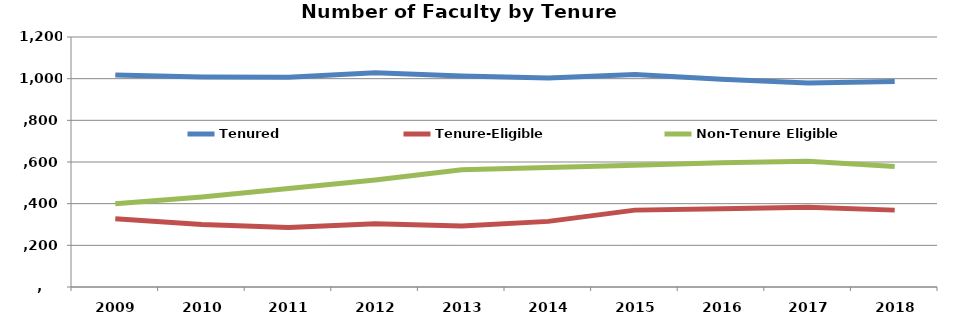
| Category | Tenured | Tenure-Eligible | Non-Tenure Eligible |
|---|---|---|---|
| 2009.0 | 1018 | 328 | 400 |
| 2010.0 | 1008 | 300 | 432 |
| 2011.0 | 1007 | 286 | 473 |
| 2012.0 | 1028 | 303 | 514 |
| 2013.0 | 1013 | 293 | 563 |
| 2014.0 | 1003 | 315 | 574 |
| 2015.0 | 1020 | 369 | 584 |
| 2016.0 | 997 | 376 | 596 |
| 2017.0 | 979 | 383 | 604 |
| 2018.0 | 986 | 369 | 578 |